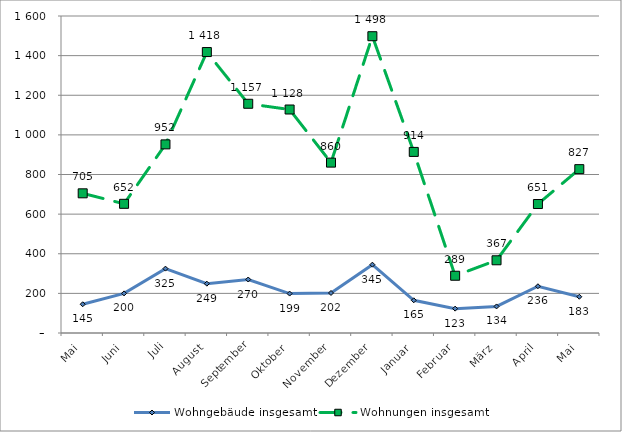
| Category | Wohngebäude insgesamt | Wohnungen insgesamt |
|---|---|---|
| Mai | 145 | 705 |
| Juni | 200 | 652 |
| Juli | 325 | 952 |
| August | 249 | 1418 |
| September | 270 | 1157 |
| Oktober | 199 | 1128 |
| November | 202 | 860 |
| Dezember | 345 | 1498 |
| Januar | 165 | 914 |
| Februar | 123 | 289 |
| März | 134 | 367 |
| April | 236 | 651 |
| Mai | 183 | 827 |